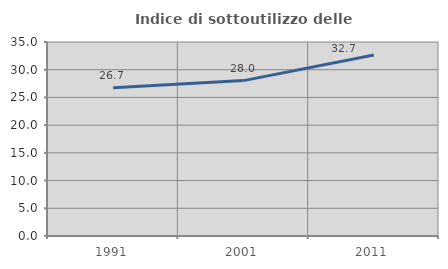
| Category | Indice di sottoutilizzo delle abitazioni  |
|---|---|
| 1991.0 | 26.735 |
| 2001.0 | 28.032 |
| 2011.0 | 32.652 |